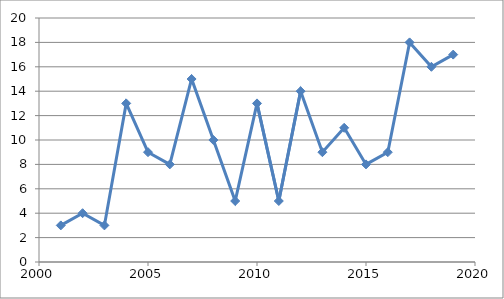
| Category | Series 0 |
|---|---|
| 2001.0 | 3 |
| 2002.0 | 4 |
| 2003.0 | 3 |
| 2004.0 | 13 |
| 2005.0 | 9 |
| 2006.0 | 8 |
| 2007.0 | 15 |
| 2008.0 | 10 |
| 2009.0 | 5 |
| 2010.0 | 13 |
| 2011.0 | 5 |
| 2012.0 | 14 |
| 2013.0 | 9 |
| 2014.0 | 11 |
| 2015.0 | 8 |
| 2016.0 | 9 |
| 2017.0 | 18 |
| 2018.0 | 16 |
| 2019.0 | 17 |